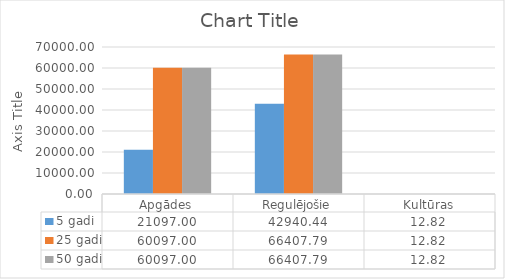
| Category | 5 gadi | 25 gadi | 50 gadi |
|---|---|---|---|
| Apgādes | 21097 | 60097 | 60097 |
| Regulējošie | 42940.44 | 66407.787 | 66407.787 |
| Kultūras | 12.82 | 12.82 | 12.82 |